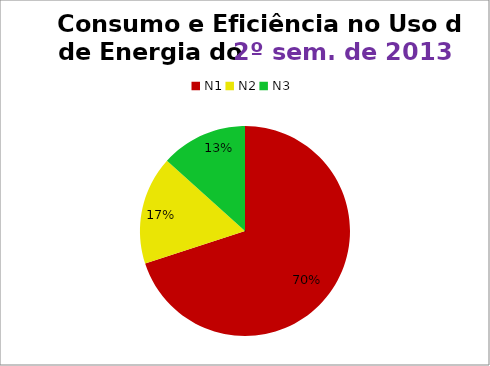
| Category | 2º/13 |
|---|---|
| N1 | 21 |
| N2 | 5 |
| N3 | 4 |